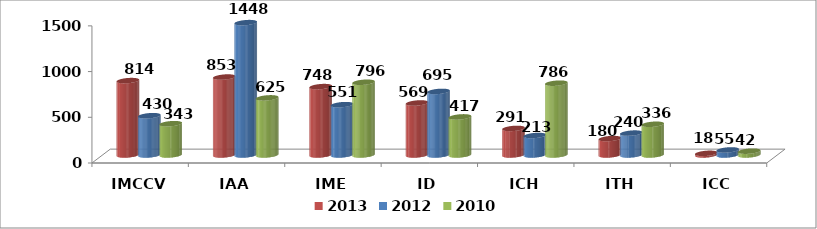
| Category | 2013 | 2012 | 2010 |
|---|---|---|---|
| IMCCV | 813.7 | 429.8 | 342.5 |
| IAA | 852.7 | 1447.8 | 624.8 |
| IME | 748 | 550.7 | 795.7 |
| ID | 569 | 695.4 | 416.8 |
| ICH | 290.7 | 213.2 | 785.6 |
| ITH | 179.6 | 239.5 | 336.2 |
| ICC | 18.3 | 55.3 | 42.1 |